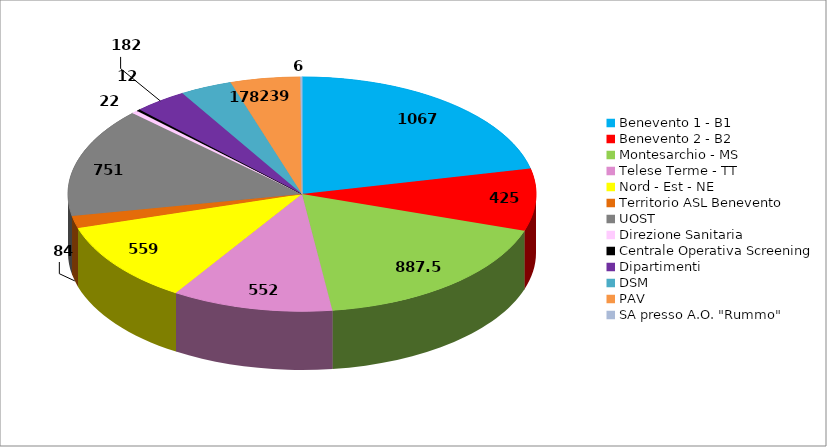
| Category | Series 0 |
|---|---|
| Benevento 1 - B1 | 1067 |
| Benevento 2 - B2 | 425 |
| Montesarchio - MS | 887.5 |
| Telese Terme - TT | 552 |
| Nord - Est - NE | 559 |
| Territorio ASL Benevento | 84 |
| UOST | 751 |
| Direzione Sanitaria | 22 |
| Centrale Operativa Screening | 12 |
| Dipartimenti | 182 |
| DSM | 178 |
| PAV | 239 |
| SA presso A.O. "Rummo" | 6 |